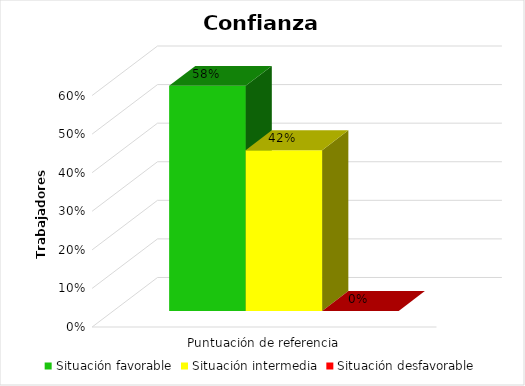
| Category | Situación favorable | Situación intermedia  | Situación desfavorable |
|---|---|---|---|
| 0 | 0.583 | 0.417 | 0 |